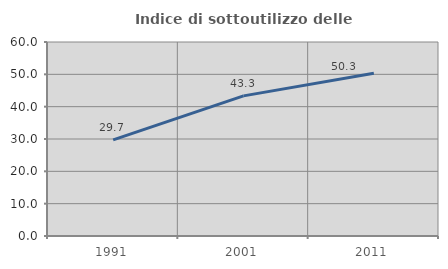
| Category | Indice di sottoutilizzo delle abitazioni  |
|---|---|
| 1991.0 | 29.748 |
| 2001.0 | 43.343 |
| 2011.0 | 50.305 |